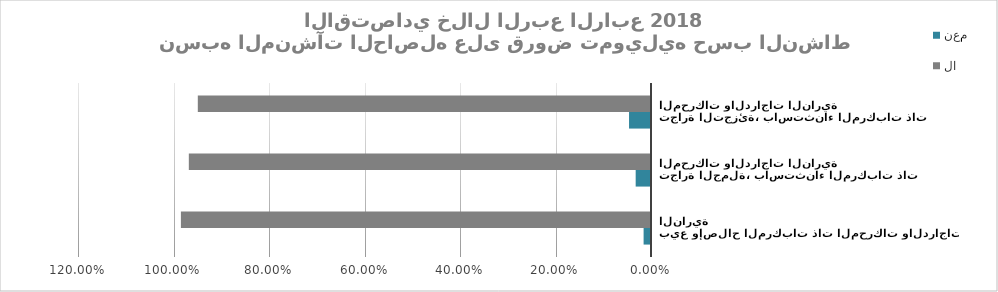
| Category | نعم | لا |
|---|---|---|
| بيع وإصلاح المركبات ذات المحركات والدراجات النارية | 0.016 | 0.984 |
| تجارة الجملة، باستثناء المركبات ذات المحركات والدراجات النارية | 0.032 | 0.968 |
| تجارة التجزئة، باستثناء المركبات ذات المحركات والدراجات النارية | 0.046 | 0.949 |